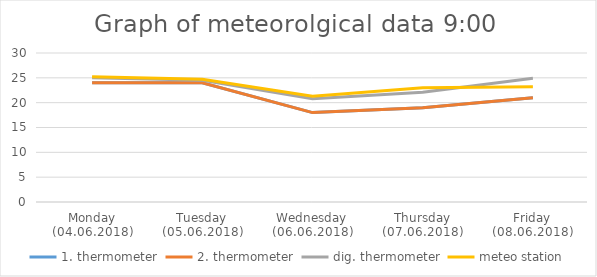
| Category | 1. thermometer | 2. thermometer | dig. thermometer | meteo station |
|---|---|---|---|---|
| Monday (04.06.2018) | 24 | 24 | 25 | 25.2 |
| Tuesday (05.06.2018) | 24 | 24 | 24.5 | 24.7 |
| Wednesday (06.06.2018) | 18 | 18 | 20.8 | 21.3 |
| Thursday (07.06.2018) | 19 | 19 | 22.1 | 23 |
| Friday (08.06.2018) | 21 | 21 | 24.9 | 23.2 |